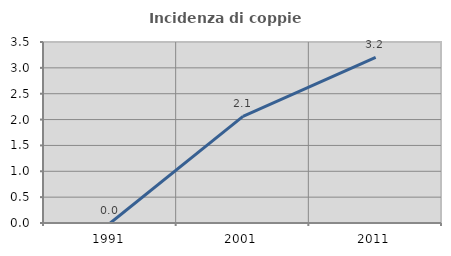
| Category | Incidenza di coppie miste |
|---|---|
| 1991.0 | 0 |
| 2001.0 | 2.062 |
| 2011.0 | 3.204 |